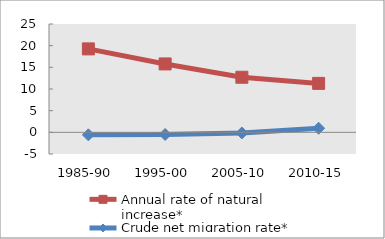
| Category | Annual rate of natural increase* | Crude net migration rate* |
|---|---|---|
| 1985-90 | 19.255 | -0.582 |
| 1995-00 | 15.784 | -0.493 |
| 2005-10 | 12.709 | -0.143 |
| 2010-15 | 11.296 | 0.941 |